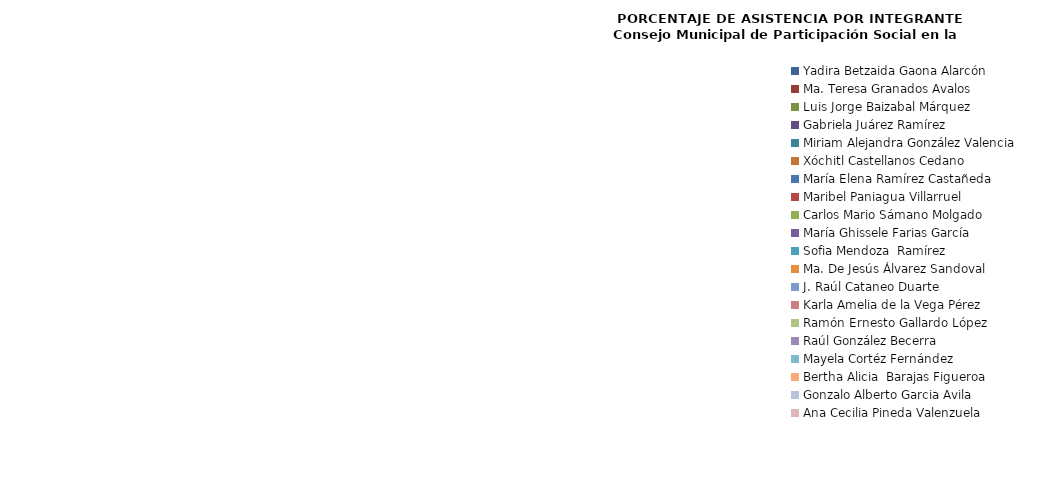
| Category | Series 0 |
|---|---|
| Yadira Betzaida Gaona Alarcón | 0 |
| Ma. Teresa Granados Avalos | 0 |
| Luis Jorge Baizabal Márquez | 0 |
| Gabriela Juárez Ramírez | 0 |
| Miriam Alejandra González Valencia | 0 |
| Xóchitl Castellanos Cedano | 0 |
| María Elena Ramírez Castañeda | 0 |
| Maribel Paniagua Villarruel | 0 |
| Carlos Mario Sámano Molgado | 0 |
| María Ghissele Farias García | 0 |
| Sofia Mendoza  Ramírez | 0 |
| Ma. De Jesús Álvarez Sandoval  | 0 |
| J. Raúl Cataneo Duarte | 0 |
| Karla Amelia de la Vega Pérez | 0 |
| Ramón Ernesto Gallardo López | 0 |
| Raúl González Becerra | 0 |
| Mayela Cortéz Fernández | 0 |
| Bertha Alicia  Barajas Figueroa | 0 |
| Gonzalo Alberto Garcia Avila | 0 |
| Ana Cecilia Pineda Valenzuela | 0 |